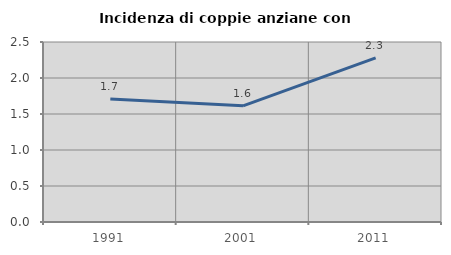
| Category | Incidenza di coppie anziane con figli |
|---|---|
| 1991.0 | 1.709 |
| 2001.0 | 1.613 |
| 2011.0 | 2.279 |